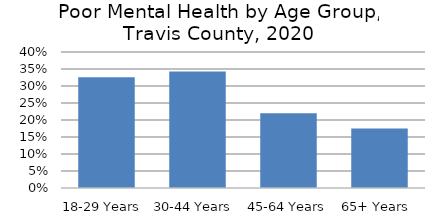
| Category | Series 0 |
|---|---|
| 18-29 Years  | 0.326 |
| 30-44 Years  | 0.343 |
| 45-64 Years | 0.22 |
| 65+ Years  | 0.175 |